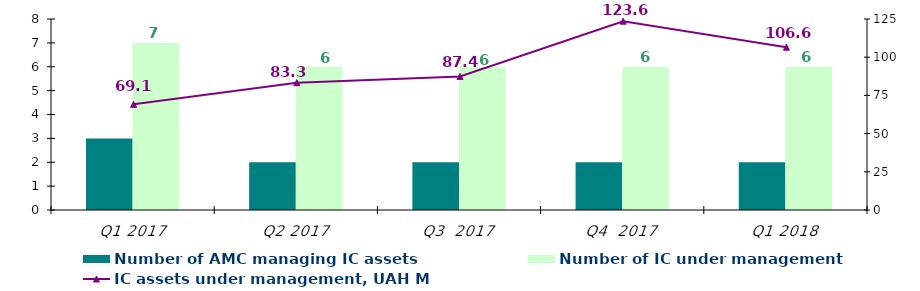
| Category | Number of AMC managing IC assets | Number of IC under management |
|---|---|---|
| Q1 2017 | 3 | 7 |
| Q2 2017 | 2 | 6 |
| Q3  2017 | 2 | 6 |
| Q4  2017 | 2 | 6 |
| Q1 2018 | 2 | 6 |